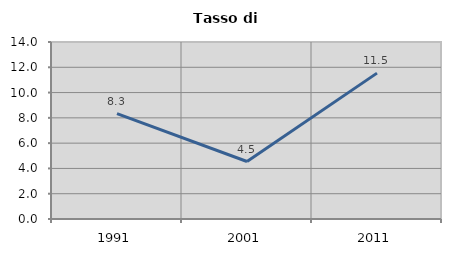
| Category | Tasso di disoccupazione   |
|---|---|
| 1991.0 | 8.333 |
| 2001.0 | 4.545 |
| 2011.0 | 11.538 |